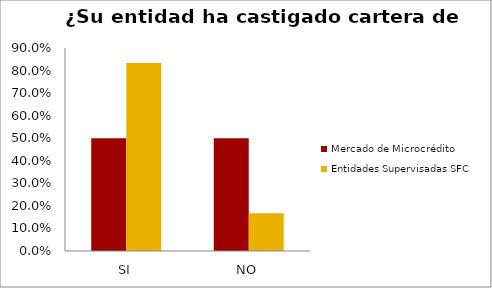
| Category | Mercado de Microcrédito | Entidades Supervisadas SFC |
|---|---|---|
| SI | 0.5 | 0.833 |
| NO | 0.5 | 0.167 |